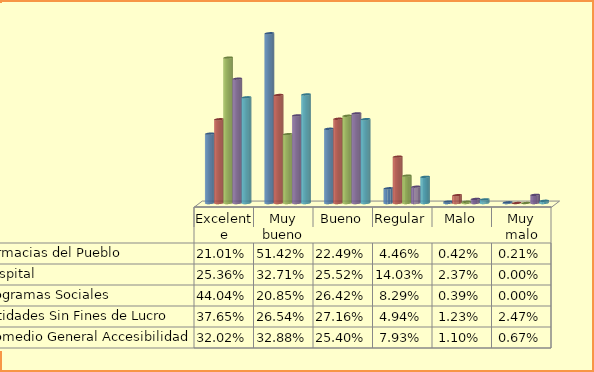
| Category | Farmacias del Pueblo | Hospital  | Programas Sociales | Entidades Sin Fines de Lucro | Promedio General Accesibilidad |
|---|---|---|---|---|---|
| Excelente | 0.21 | 0.254 | 0.44 | 0.377 | 0.32 |
| Muy bueno | 0.514 | 0.327 | 0.209 | 0.265 | 0.329 |
| Bueno | 0.225 | 0.255 | 0.264 | 0.272 | 0.254 |
| Regular | 0.045 | 0.14 | 0.083 | 0.049 | 0.079 |
| Malo | 0.004 | 0.024 | 0.004 | 0.012 | 0.011 |
| Muy malo | 0.002 | 0 | 0 | 0.025 | 0.007 |